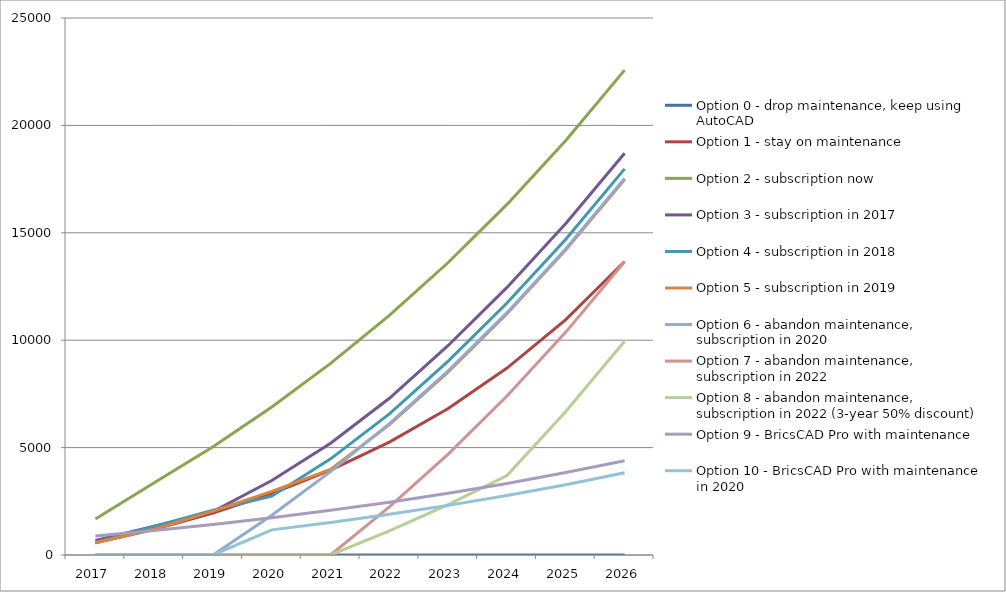
| Category | Option 0 - drop maintenance, keep using AutoCAD | Option 1 - stay on maintenance | Option 2 - subscription now | Option 3 - subscription in 2017 | Option 4 - subscription in 2018 | Option 5 - subscription in 2019 | Option 6 - abandon maintenance, subscription in 2020 | Option 7 - abandon maintenance, subscription in 2022 | Option 8 - abandon maintenance, subscription in 2022 (3-year 50% discount) | Option 9 - BricsCAD Pro with maintenance | Option 10 - BricsCAD Pro with maintenance in 2020 |
|---|---|---|---|---|---|---|---|---|---|---|---|
| 2017.0 | 0 | 572.25 | 1680 | 672 | 572.25 | 572.25 | 0 | 0 | 0 | 880 | 0 |
| 2018.0 | 0 | 1201.725 | 3360 | 1344 | 1328.25 | 1201.725 | 0 | 0 | 0 | 1138.5 | 0 |
| 2019.0 | 0 | 1957.095 | 5040 | 2016 | 2084.25 | 2041.725 | 0 | 0 | 0 | 1422.85 | 0 |
| 2020.0 | 0 | 2863.539 | 6888 | 3466.31 | 2736.89 | 2965.725 | 1848 | 0 | 0 | 1735.635 | 1171.28 |
| 2021.0 | 0 | 3951.272 | 8920.8 | 5206.683 | 4477.262 | 3982.125 | 3880.8 | 0 | 0 | 2079.698 | 1515.344 |
| 2022.0 | 0 | 5256.551 | 11156.88 | 7295.13 | 6565.709 | 6070.572 | 6116.88 | 2236.08 | 1118.04 | 2458.168 | 1893.813 |
| 2023.0 | 0 | 6822.886 | 13616.568 | 9753.818 | 9024.397 | 8529.26 | 8576.568 | 4695.768 | 2347.884 | 2874.485 | 2310.13 |
| 2024.0 | 0 | 8702.489 | 16322.225 | 12458.475 | 11729.054 | 11233.917 | 11282.225 | 7401.425 | 3700.712 | 3332.434 | 2768.079 |
| 2025.0 | 0 | 10958.011 | 19298.447 | 15433.697 | 14704.276 | 14209.139 | 14258.447 | 10377.647 | 6676.935 | 3836.177 | 3271.822 |
| 2026.0 | 0 | 13664.639 | 22572.292 | 18706.542 | 17977.121 | 17481.984 | 17532.292 | 13651.492 | 9950.78 | 4390.295 | 3825.94 |